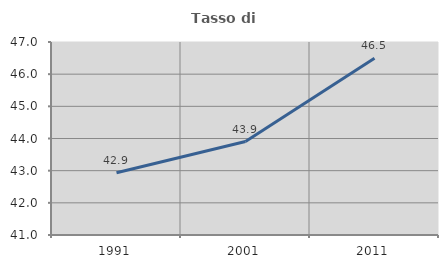
| Category | Tasso di occupazione   |
|---|---|
| 1991.0 | 42.936 |
| 2001.0 | 43.905 |
| 2011.0 | 46.498 |